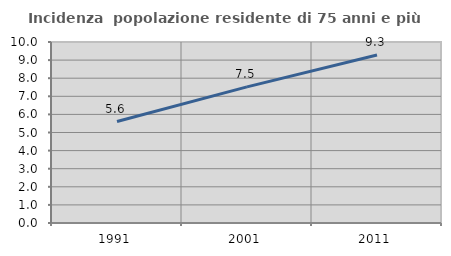
| Category | Incidenza  popolazione residente di 75 anni e più |
|---|---|
| 1991.0 | 5.604 |
| 2001.0 | 7.523 |
| 2011.0 | 9.279 |